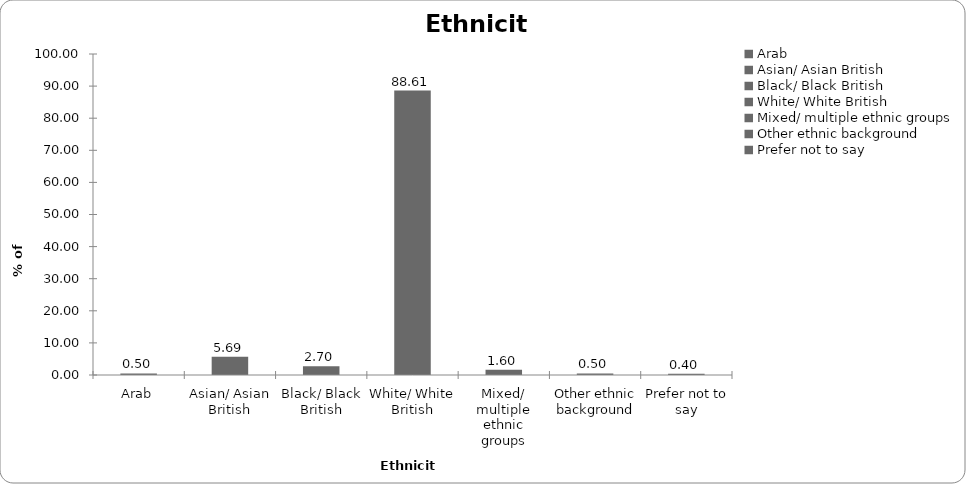
| Category | Ethnicity |
|---|---|
| Arab | 0.5 |
| Asian/ Asian British | 5.694 |
| Black/ Black British | 2.697 |
| White/ White British | 88.611 |
| Mixed/ multiple ethnic groups | 1.598 |
| Other ethnic background | 0.5 |
| Prefer not to say | 0.4 |